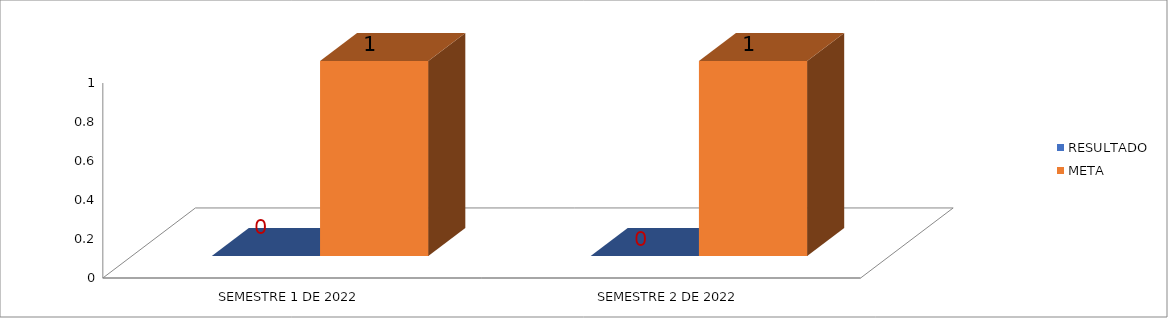
| Category | RESULTADO | META |
|---|---|---|
| SEMESTRE 1 DE 2022 | 0 | 1 |
| SEMESTRE 2 DE 2022 | 0 | 1 |